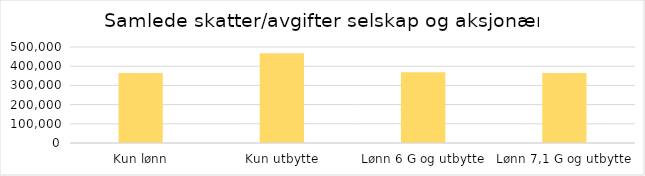
| Category | Series 0 |
|---|---|
| Kun lønn | 364032.734 |
| Kun utbytte | 467104 |
| Lønn 6 G og utbytte | 368297.343 |
| Lønn 7,1 G og utbytte | 364506.142 |